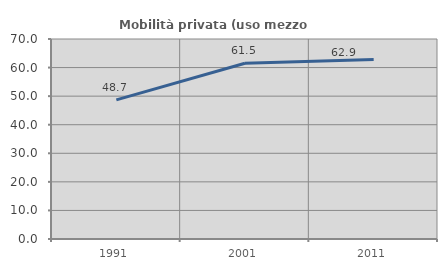
| Category | Mobilità privata (uso mezzo privato) |
|---|---|
| 1991.0 | 48.676 |
| 2001.0 | 61.52 |
| 2011.0 | 62.859 |